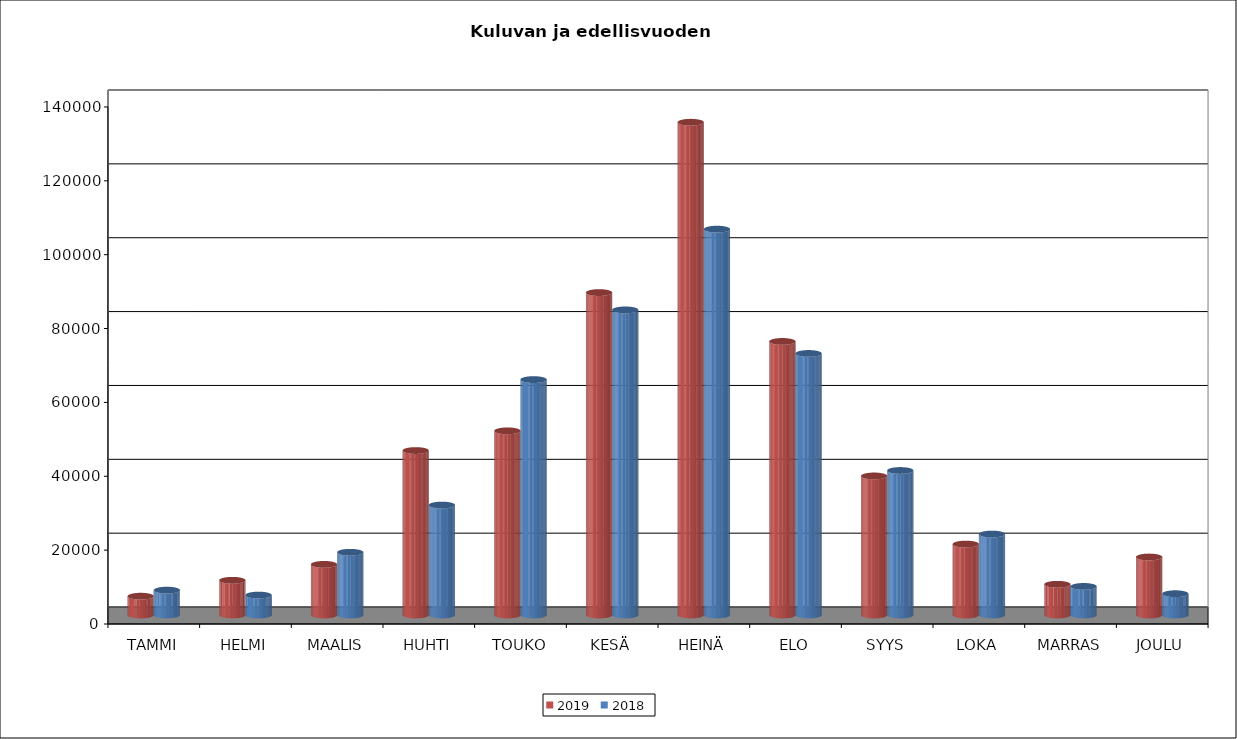
| Category | 2019 | 2018 |
|---|---|---|
| TAMMI | 5088 | 6731 |
| HELMI | 9398 | 5400 |
| MAALIS | 13710 | 16983 |
| HUHTI | 44534 | 29770 |
| TOUKO | 49864 | 63742 |
| KESÄ | 87301 | 82610 |
| HEINÄ | 133418 | 104478 |
| ELO | 74073 | 70815 |
| SYYS | 37650 | 39128 |
| LOKA | 19209 | 21923 |
| MARRAS | 8319 | 7739 |
| JOULU | 15702 | 5764 |